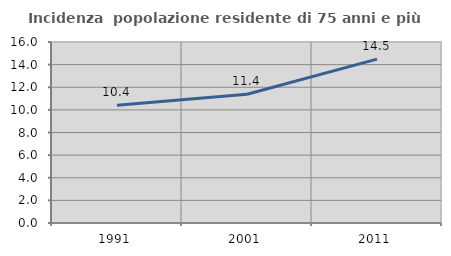
| Category | Incidenza  popolazione residente di 75 anni e più |
|---|---|
| 1991.0 | 10.415 |
| 2001.0 | 11.375 |
| 2011.0 | 14.489 |